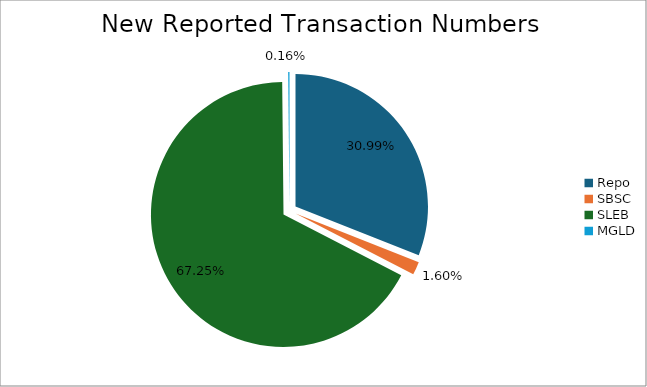
| Category | Series 0 |
|---|---|
| Repo | 479527 |
| SBSC | 24816 |
| SLEB | 1040820 |
| MGLD | 2434 |